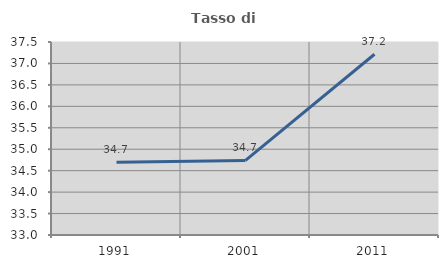
| Category | Tasso di occupazione   |
|---|---|
| 1991.0 | 34.696 |
| 2001.0 | 34.74 |
| 2011.0 | 37.214 |